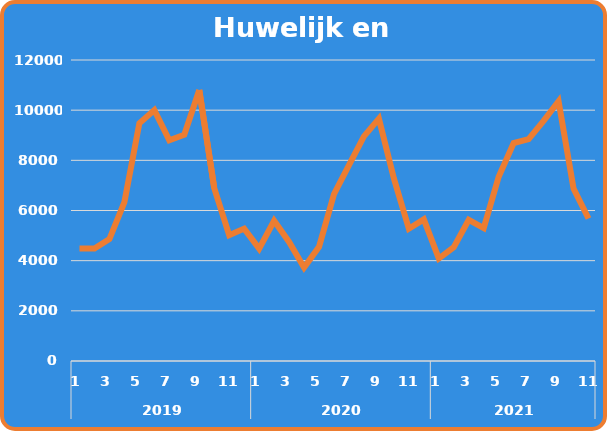
| Category | Totaal |
|---|---|
| 0 | 4486 |
| 1 | 4483 |
| 2 | 4860 |
| 3 | 6332 |
| 4 | 9480 |
| 5 | 10002 |
| 6 | 8802 |
| 7 | 9019 |
| 8 | 10801 |
| 9 | 6894 |
| 10 | 5013 |
| 11 | 5278 |
| 12 | 4479 |
| 13 | 5590 |
| 14 | 4747 |
| 15 | 3723 |
| 16 | 4552 |
| 17 | 6651 |
| 18 | 7809 |
| 19 | 8957 |
| 20 | 9661 |
| 21 | 7280 |
| 22 | 5273 |
| 23 | 5647 |
| 24 | 4085 |
| 25 | 4536 |
| 26 | 5625 |
| 27 | 5301 |
| 28 | 7345 |
| 29 | 8690 |
| 30 | 8849 |
| 31 | 9575 |
| 32 | 10358 |
| 33 | 6876 |
| 34 | 5681 |